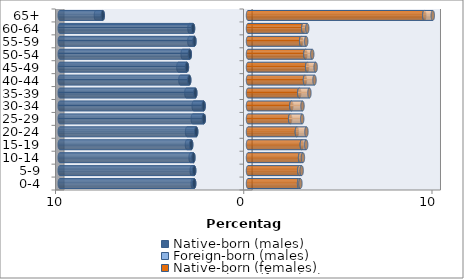
| Category | Native-born (males) | Foreign-born (males) | Native-born (females) | Foreign-born (females) |
|---|---|---|---|---|
| 0-4 | -2.858 | -0.078 | 2.713 | 0.071 |
| 5-9 | -2.859 | -0.132 | 2.723 | 0.127 |
| 10-14 | -2.901 | -0.15 | 2.766 | 0.152 |
| 15-19 | -3.018 | -0.225 | 2.86 | 0.231 |
| 20-24 | -2.751 | -0.485 | 2.596 | 0.507 |
| 25-29 | -2.346 | -0.589 | 2.239 | 0.64 |
| 30-34 | -2.358 | -0.528 | 2.303 | 0.591 |
| 35-39 | -2.8 | -0.476 | 2.722 | 0.54 |
| 40-44 | -3.121 | -0.47 | 3.025 | 0.507 |
| 45-49 | -3.244 | -0.457 | 3.141 | 0.452 |
| 50-54 | -3.092 | -0.379 | 3.048 | 0.364 |
| 55-59 | -2.846 | -0.27 | 2.824 | 0.269 |
| 60-64 | -2.919 | -0.191 | 2.935 | 0.212 |
| 65+ | -7.715 | -0.364 | 9.365 | 0.451 |